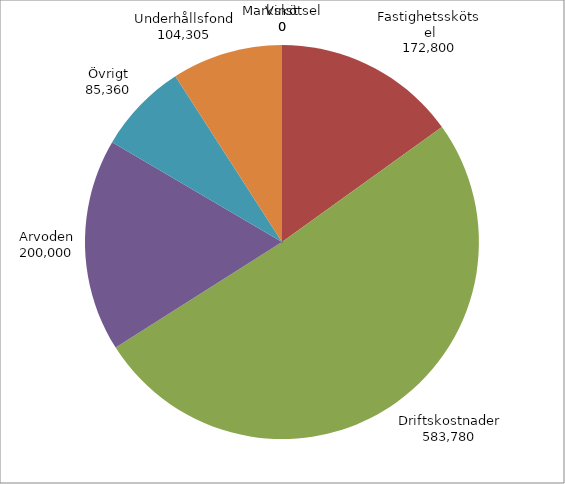
| Category | Series 0 |
|---|---|
| Markskötsel | 0 |
| Fastighetsskötsel | 172800 |
| Driftskostnader | 583780 |
| Arvoden | 200000 |
| Övrigt | 85360 |
| Underhållsfond | 104305 |
| Vinst | 0 |